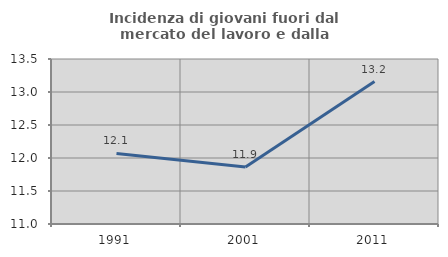
| Category | Incidenza di giovani fuori dal mercato del lavoro e dalla formazione  |
|---|---|
| 1991.0 | 12.069 |
| 2001.0 | 11.864 |
| 2011.0 | 13.158 |